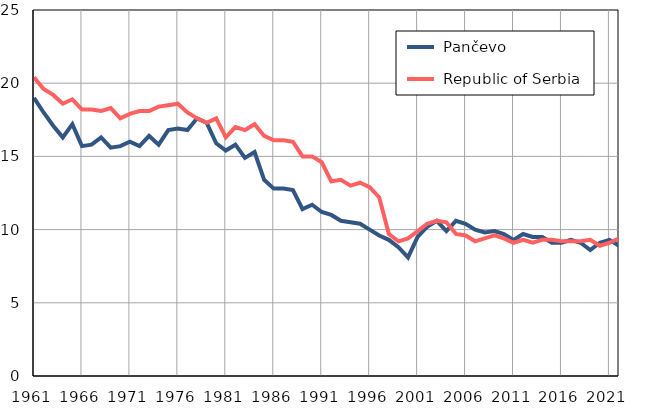
| Category |  Pančevo |  Republic of Serbia |
|---|---|---|
| 1961.0 | 19 | 20.4 |
| 1962.0 | 18 | 19.6 |
| 1963.0 | 17.1 | 19.2 |
| 1964.0 | 16.3 | 18.6 |
| 1965.0 | 17.2 | 18.9 |
| 1966.0 | 15.7 | 18.2 |
| 1967.0 | 15.8 | 18.2 |
| 1968.0 | 16.3 | 18.1 |
| 1969.0 | 15.6 | 18.3 |
| 1970.0 | 15.7 | 17.6 |
| 1971.0 | 16 | 17.9 |
| 1972.0 | 15.7 | 18.1 |
| 1973.0 | 16.4 | 18.1 |
| 1974.0 | 15.8 | 18.4 |
| 1975.0 | 16.8 | 18.5 |
| 1976.0 | 16.9 | 18.6 |
| 1977.0 | 16.8 | 18 |
| 1978.0 | 17.6 | 17.6 |
| 1979.0 | 17.3 | 17.3 |
| 1980.0 | 15.9 | 17.6 |
| 1981.0 | 15.4 | 16.3 |
| 1982.0 | 15.8 | 17 |
| 1983.0 | 14.9 | 16.8 |
| 1984.0 | 15.3 | 17.2 |
| 1985.0 | 13.4 | 16.4 |
| 1986.0 | 12.8 | 16.1 |
| 1987.0 | 12.8 | 16.1 |
| 1988.0 | 12.7 | 16 |
| 1989.0 | 11.4 | 15 |
| 1990.0 | 11.7 | 15 |
| 1991.0 | 11.2 | 14.6 |
| 1992.0 | 11 | 13.3 |
| 1993.0 | 10.6 | 13.4 |
| 1994.0 | 10.5 | 13 |
| 1995.0 | 10.4 | 13.2 |
| 1996.0 | 10 | 12.9 |
| 1997.0 | 9.6 | 12.2 |
| 1998.0 | 9.3 | 9.7 |
| 1999.0 | 8.8 | 9.2 |
| 2000.0 | 8.1 | 9.4 |
| 2001.0 | 9.5 | 9.9 |
| 2002.0 | 10.2 | 10.4 |
| 2003.0 | 10.6 | 10.6 |
| 2004.0 | 9.9 | 10.5 |
| 2005.0 | 10.6 | 9.7 |
| 2006.0 | 10.4 | 9.6 |
| 2007.0 | 10 | 9.2 |
| 2008.0 | 9.8 | 9.4 |
| 2009.0 | 9.9 | 9.6 |
| 2010.0 | 9.7 | 9.4 |
| 2011.0 | 9.3 | 9.1 |
| 2012.0 | 9.7 | 9.3 |
| 2013.0 | 9.5 | 9.1 |
| 2014.0 | 9.5 | 9.3 |
| 2015.0 | 9.1 | 9.3 |
| 2016.0 | 9.1 | 9.2 |
| 2017.0 | 9.3 | 9.2 |
| 2018.0 | 9.1 | 9.2 |
| 2019.0 | 8.6 | 9.3 |
| 2020.0 | 9.1 | 8.9 |
| 2021.0 | 9.3 | 9.1 |
| 2022.0 | 8.9 | 9.4 |